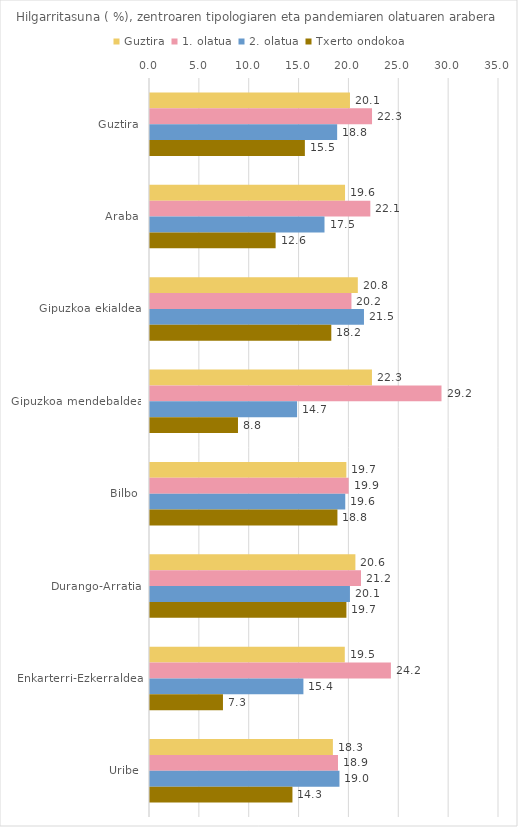
| Category | Guztira | 1. olatua | 2. olatua | Txerto ondokoa |
|---|---|---|---|---|
| Guztira | 20.055 | 22.267 | 18.769 | 15.531 |
| Araba | 19.56 | 22.096 | 17.5 | 12.598 |
| Gipuzkoa ekialdea | 20.841 | 20.202 | 21.458 | 18.182 |
| Gipuzkoa mendebaldea | 22.259 | 29.234 | 14.749 | 8.824 |
| Bilbo | 19.692 | 19.922 | 19.582 | 18.797 |
| Durango-Arratia | 20.599 | 21.16 | 20.052 | 19.697 |
| Enkarterri-Ezkerraldea | 19.534 | 24.158 | 15.385 | 7.317 |
| Uribe | 18.341 | 18.852 | 19 | 14.286 |